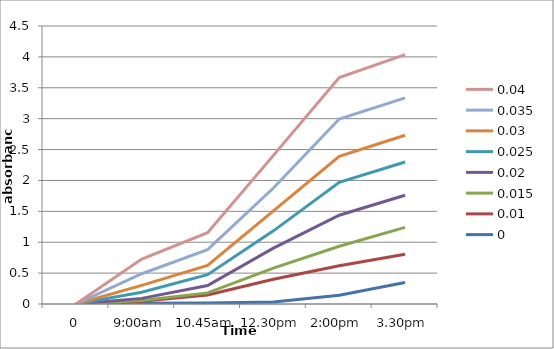
| Category | 0 | 0.01 | 0.015 | 0.02 | 0.025 | 0.03 | 0.035 | 0.04 |
|---|---|---|---|---|---|---|---|---|
| 0 | 0 | 0 | 0 | 0 | 0 | 0 | 0 | 0 |
| 9:00am | 0.011 | 0.032 | 0.015 | 0.033 | 0.098 | 0.112 | 0.189 | 0.237 |
| 10.45am | 0.017 | 0.13 | 0.033 | 0.119 | 0.175 | 0.15 | 0.256 | 0.274 |
| 12.30pm | 0.031 | 0.37 | 0.18 | 0.323 | 0.28 | 0.323 | 0.371 | 0.528 |
| 2:00pm | 0.143 | 0.476 | 0.316 | 0.502 | 0.532 | 0.421 | 0.604 | 0.67 |
| 3.30pm | 0.348 | 0.456 | 0.436 | 0.52 | 0.538 | 0.434 | 0.605 | 0.7 |